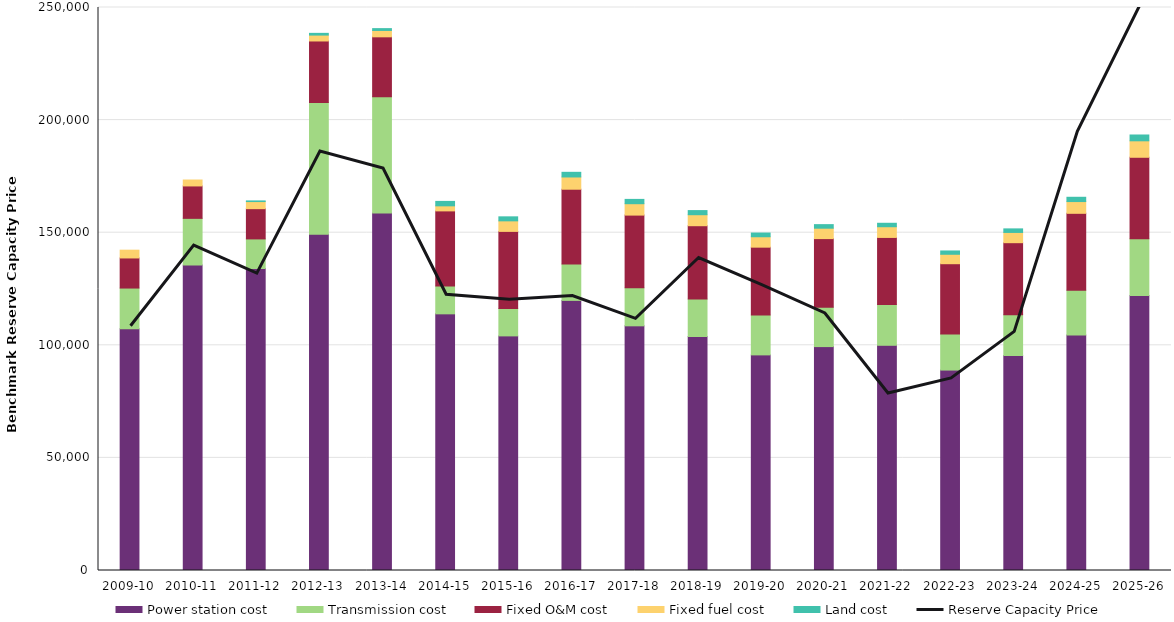
| Category | Power station cost | Transmission cost | Fixed O&M cost | Fixed fuel cost | Land cost |
|---|---|---|---|---|---|
| 2009-10 | 107404 | 18017 | 13363.362 | 3456 | 0 |
| 2010-11 | 135701 | 20672 | 14392.09 | 2631 | 0 |
| 2011-12 | 134091 | 13151 | 13431 | 3151 | 293 |
| 2012-13 | 149306 | 58493 | 27335 | 2615 | 769 |
| 2013-14 | 158709.623 | 51620.522 | 26648.64 | 2824.586 | 817.615 |
| 2014-15 | 113971.12 | 12329.343 | 33384.489 | 2239.074 | 1972.549 |
| 2015-16 | 104178.112 | 12164.145 | 34238.67 | 4680.099 | 1783.445 |
| 2016-17 | 119941.752 | 16127.011 | 33238.009 | 5441.541 | 2064.392 |
| 2017-18 | 108648.716 | 16860.304 | 32307.017 | 5060.976 | 1912.366 |
| 2018-19 | 103897.67 | 16623.829 | 32581.684 | 4886.054 | 1830.732 |
| 2019-20 | 95744.972 | 17691.164 | 30143.2 | 4620.095 | 1650.409 |
| 2020-21 | 99424.958 | 17520.238 | 30437 | 4615.275 | 1585.402 |
| 2021-22 | 100002.334 | 18119.653 | 29776.44 | 4752.811 | 1534.875 |
| 2022-23 | 89002.193 | 16061.787 | 31168.015 | 4186.032 | 1471.786 |
| 2023-24 | 95417.093 | 18120.252 | 32027.659 | 4548.364 | 1581.24 |
| 2024-25 | 104557.707 | 19918.14 | 34131 | 5218.04 | 1904.062 |
| 2025-26 | 122168.841 | 25093.743 | 36227.549 | 7313.729 | 2583.017 |